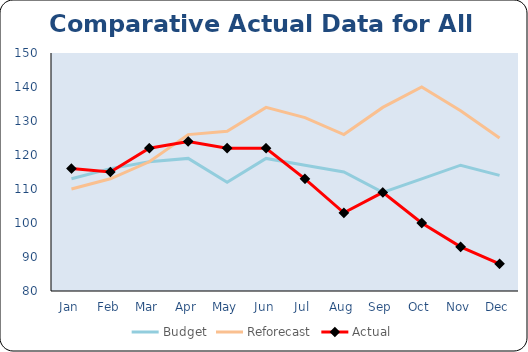
| Category | Budget | Reforecast | Actual |
|---|---|---|---|
| Jan | 113 | 110 | 116 |
| Feb | 116 | 113 | 115 |
| Mar | 118 | 118 | 122 |
| Apr | 119 | 126 | 124 |
| May | 112 | 127 | 122 |
| Jun | 119 | 134 | 122 |
| Jul | 117 | 131 | 113 |
| Aug | 115 | 126 | 103 |
| Sep | 109 | 134 | 109 |
| Oct | 113 | 140 | 100 |
| Nov | 117 | 133 | 93 |
| Dec | 114 | 125 | 88 |